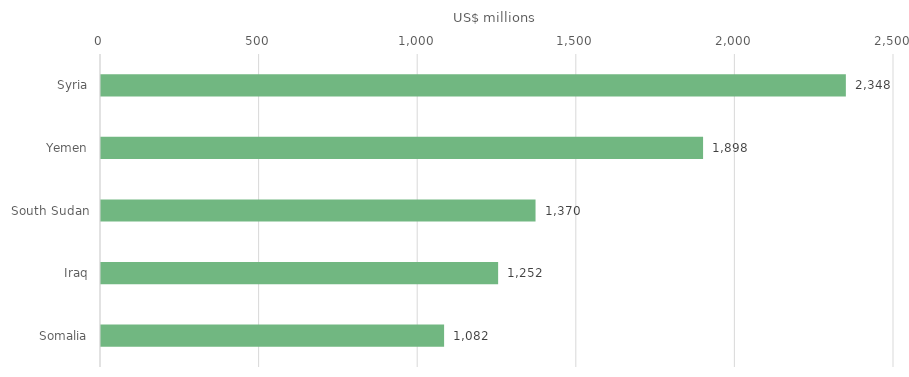
| Category | Series 0 |
|---|---|
| Syria | 2348.233 |
| Yemen | 1898.1 |
| South Sudan | 1369.916 |
| Iraq | 1251.997 |
| Somalia | 1081.666 |